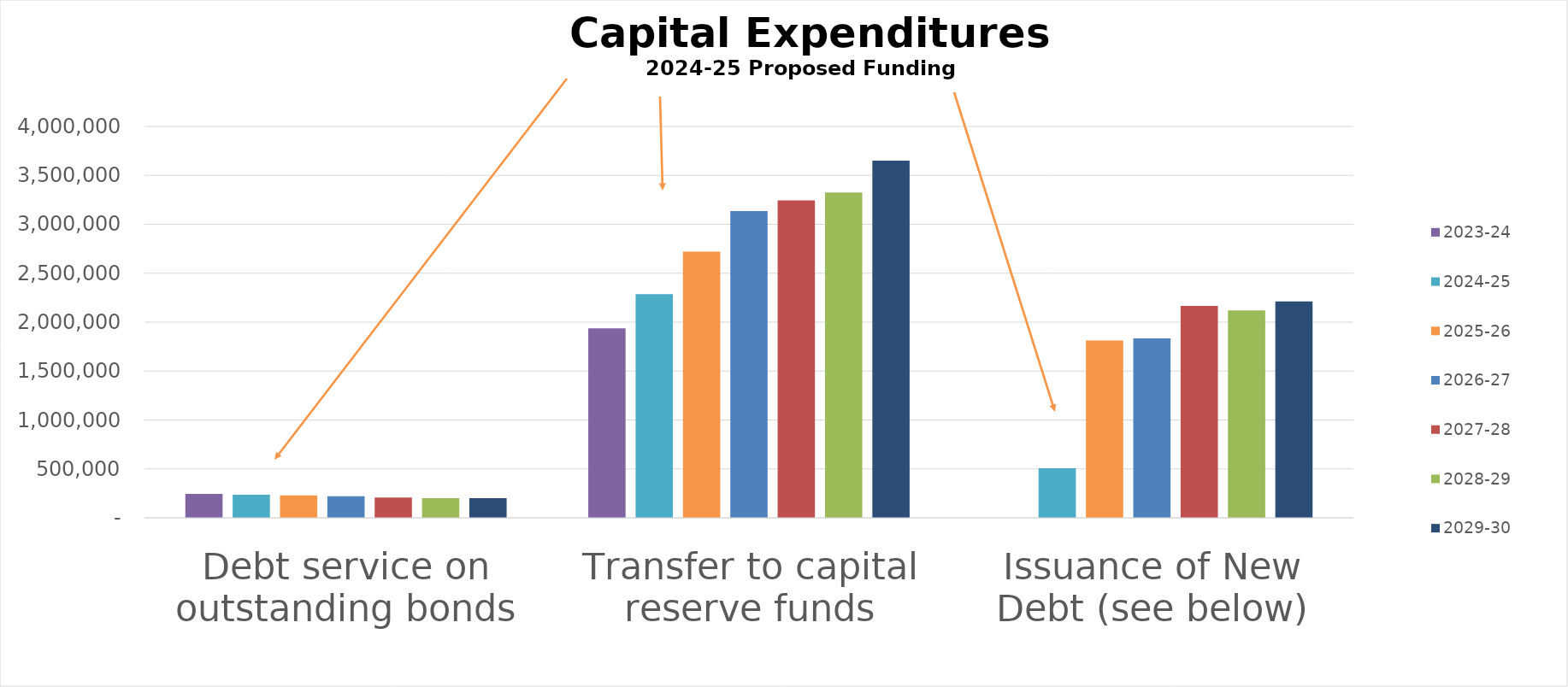
| Category | 2023-24 | 2024-25 | 2025-26 | 2026-27 | 2027-28 | 2028-29 | 2029-30 |
|---|---|---|---|---|---|---|---|
| Debt service on outstanding bonds | 244145 | 236240 | 228335 | 220430 | 207525 | 199875 | 199875 |
| Transfer to capital reserve funds | 1937250 | 2285000 | 2720000 | 3135000 | 3245000 | 3325000 | 3650000 |
| Issuance of New Debt (see below) | 0 | 507338 | 1812764 | 1833404 | 2165598 | 2120883 | 2211168 |